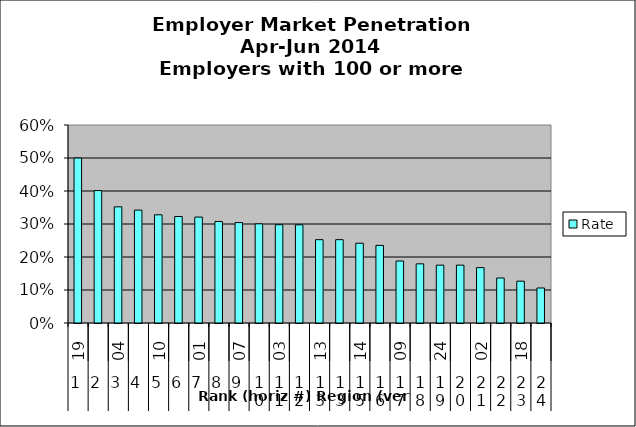
| Category | Rate |
|---|---|
| 0 | 0.5 |
| 1 | 0.401 |
| 2 | 0.352 |
| 3 | 0.342 |
| 4 | 0.328 |
| 5 | 0.323 |
| 6 | 0.321 |
| 7 | 0.308 |
| 8 | 0.304 |
| 9 | 0.301 |
| 10 | 0.298 |
| 11 | 0.298 |
| 12 | 0.253 |
| 13 | 0.253 |
| 14 | 0.242 |
| 15 | 0.235 |
| 16 | 0.188 |
| 17 | 0.179 |
| 18 | 0.175 |
| 19 | 0.175 |
| 20 | 0.168 |
| 21 | 0.136 |
| 22 | 0.127 |
| 23 | 0.106 |